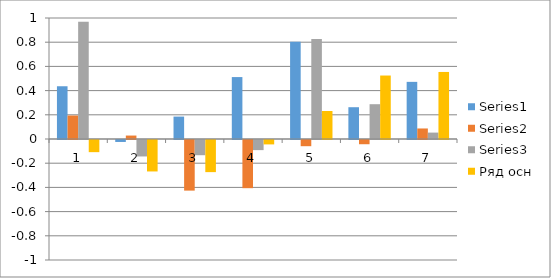
| Category | Series 0 | Series 1 | Series 2 | Ряд осн |
|---|---|---|---|---|
| 0 | 0.436 | 0.194 | 0.969 | -0.1 |
| 1 | -0.016 | 0.029 | -0.136 | -0.26 |
| 2 | 0.185 | -0.418 | -0.126 | -0.266 |
| 3 | 0.512 | -0.398 | -0.084 | -0.036 |
| 4 | 0.803 | -0.051 | 0.826 | 0.231 |
| 5 | 0.263 | -0.035 | 0.288 | 0.525 |
| 6 | 0.472 | 0.087 | 0.053 | 0.554 |